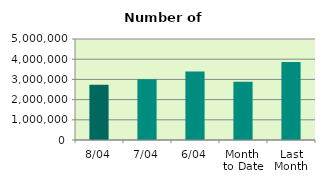
| Category | Series 0 |
|---|---|
| 8/04 | 2733182 |
| 7/04 | 3009772 |
| 6/04 | 3392798 |
| Month 
to Date | 2883550.667 |
| Last
Month | 3862771.739 |